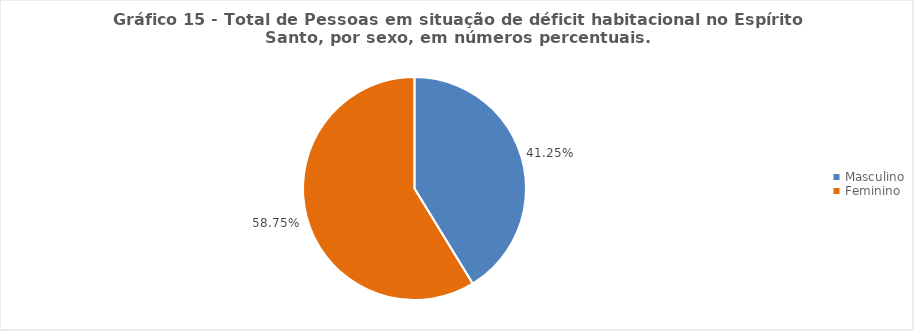
| Category | Series 0 |
|---|---|
| Masculino | 0.413 |
| Feminino | 0.587 |